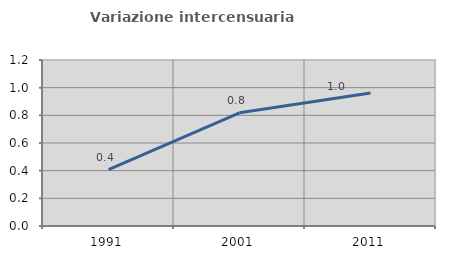
| Category | Variazione intercensuaria annua |
|---|---|
| 1991.0 | 0.407 |
| 2001.0 | 0.818 |
| 2011.0 | 0.961 |